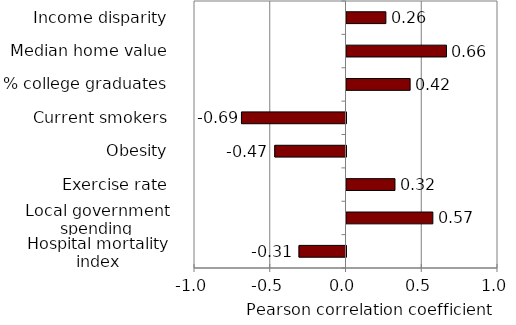
| Category | Correlation coefficient |
|---|---|
| Hospital mortality index | -0.31 |
| Local government spending | 0.57 |
| Exercise rate | 0.32 |
| Obesity | -0.47 |
| Current smokers | -0.69 |
| % college graduates | 0.42 |
| Median home value | 0.66 |
| Income disparity | 0.26 |